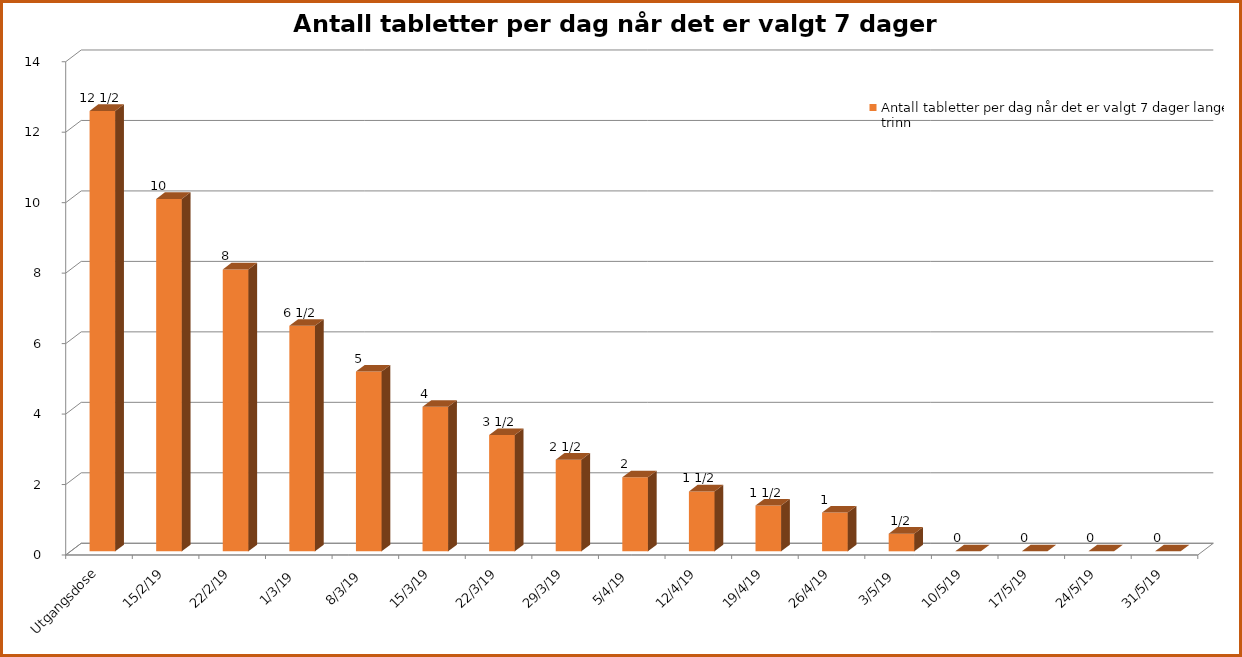
| Category | Antall tabletter per dag når det er valgt 7 dager lange trinn |
|---|---|
| Utgangsdose | 12.5 |
| 15.2.19 | 10 |
| 22.2.19 | 8 |
| 1.3.19 | 6.4 |
| 8.3.19 | 5.1 |
| 15.3.19 | 4.1 |
| 22.3.19 | 3.3 |
| 29.3.19 | 2.6 |
| 5.4.19 | 2.1 |
| 12.4.19 | 1.7 |
| 19.4.19 | 1.3 |
| 26.4.19 | 1.1 |
| 3.5.19 | 0.5 |
| 10.5.19 | 0 |
| 17.5.19 | 0 |
| 24.5.19 | 0 |
| 31.5.19 | 0 |